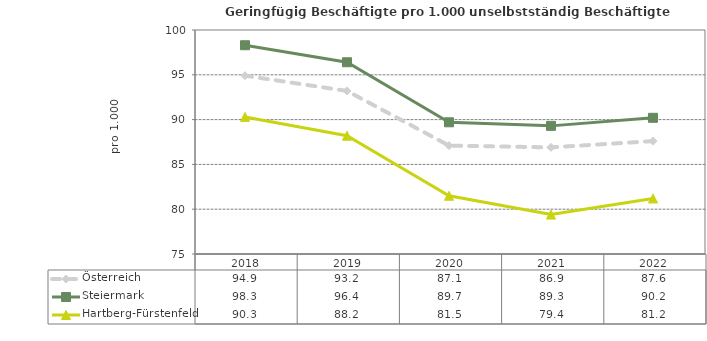
| Category | Österreich | Steiermark | Hartberg-Fürstenfeld |
|---|---|---|---|
| 2022.0 | 87.6 | 90.2 | 81.2 |
| 2021.0 | 86.9 | 89.3 | 79.4 |
| 2020.0 | 87.1 | 89.7 | 81.5 |
| 2019.0 | 93.2 | 96.4 | 88.2 |
| 2018.0 | 94.9 | 98.3 | 90.3 |